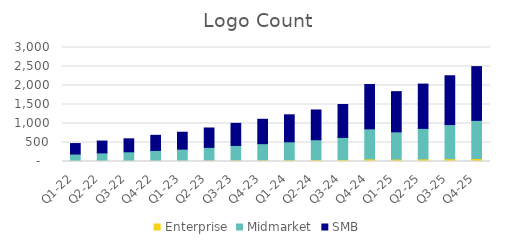
| Category | Enterprise | Midmarket | SMB |
|---|---|---|---|
| Q1-22 | 22 | 174 | 276 |
| Q2-22 | 24 | 202 | 312 |
| Q3-22 | 26 | 229 | 342 |
| Q4-22 | 29 | 262 | 398 |
| Q1-23 | 31 | 295 | 444 |
| Q2-23 | 34.291 | 337.302 | 510.353 |
| Q3-23 | 37.629 | 384.677 | 581.524 |
| Q4-23 | 40.971 | 428.33 | 641.584 |
| Q1-24 | 45.135 | 472.961 | 710.318 |
| Q2-24 | 49.379 | 523.501 | 783.106 |
| Q3-24 | 54.093 | 579.361 | 867.325 |
| Q4-24 | 69.12 | 790.92 | 1166.78 |
| Q1-25 | 64.272 | 715.917 | 1058.376 |
| Q2-25 | 68.865 | 802.532 | 1165.445 |
| Q3-25 | 73.905 | 897.928 | 1285.009 |
| Q4-25 | 79.495 | 1002.878 | 1413.968 |